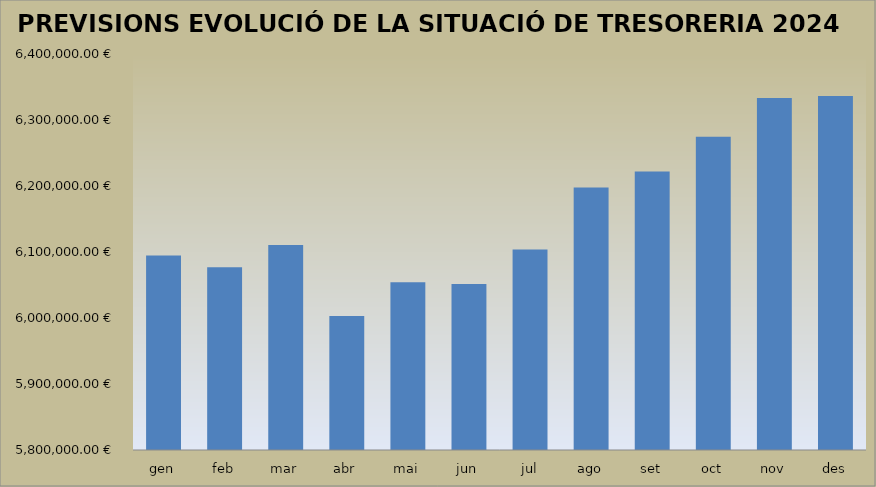
| Category | PREVISIÓ RESUM ANUAL TRESORERIA 2024 |
|---|---|
| gen | 6094667.22 |
| feb | 6076872.23 |
| mar | 6110695.89 |
| abr | 6002987.51 |
| mai | 6054344.83 |
| jun | 6051374.07 |
| jul | 6103836.79 |
| ago | 6197819.98 |
| set | 6221841.53 |
| oct | 6274686.2 |
| nov | 6333310.13 |
| des | 6336307.07 |